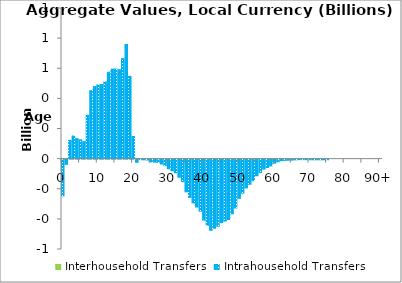
| Category | Interhousehold Transfers | Intrahousehold Transfers |
|---|---|---|
| 0 |  | -244.231 |
|  |  | -34.5 |
| 2 |  | 124.63 |
| 3 |  | 153.501 |
| 4 |  | 136.303 |
| 5 |  | 128.363 |
| 6 |  | 116.279 |
| 7 |  | 291.208 |
| 8 |  | 454.32 |
| 9 |  | 481.487 |
| 10 |  | 492.347 |
| 11 |  | 495.006 |
| 12 |  | 512.611 |
| 13 |  | 576.749 |
| 14 |  | 597.402 |
| 15 |  | 598.013 |
| 16 |  | 593.978 |
| 17 |  | 667.227 |
| 18 |  | 760.828 |
| 19 |  | 549.218 |
| 20 |  | 150.029 |
| 21 |  | -21 |
| 22 |  | -3.332 |
| 23 |  | -4.567 |
| 24 |  | -5.785 |
| 25 |  | -18.418 |
| 26 |  | -19.976 |
| 27 |  | -21.519 |
| 28 |  | -32.581 |
| 29 |  | -43.626 |
| 30 |  | -63.828 |
| 31 |  | -77.235 |
| 32 |  | -90.618 |
| 33 |  | -120.149 |
| 34 |  | -149.618 |
| 35 |  | -217.033 |
| 36 |  | -254.017 |
| 37 |  | -291.026 |
| 38 |  | -318.207 |
| 39 |  | -345.346 |
| 40 |  | -404.645 |
| 41 |  | -438.589 |
| 42 |  | -472.608 |
| 43 |  | -459.174 |
| 44 |  | -445.763 |
| 45 |  | -421.321 |
| 46 |  | -411.298 |
| 47 |  | -401.309 |
| 48 |  | -362.912 |
| 49 |  | -324.553 |
| 50 |  | -260.537 |
| 51 |  | -225.849 |
| 52 |  | -191.142 |
| 53 |  | -167.237 |
| 54 |  | -143.344 |
| 55 |  | -110.766 |
| 56 |  | -88.632 |
| 57 |  | -66.481 |
| 58 |  | -55.807 |
| 59 |  | -45.143 |
| 60 |  | -27.006 |
| 61 |  | -18.671 |
| 62 |  | -10.326 |
| 63 |  | -8.881 |
| 64 |  | -7.435 |
| 65 |  | -6.46 |
| 66 |  | -4.911 |
| 67 |  | -3.359 |
| 68 |  | -3.368 |
| 69 |  | -3.376 |
| 70 |  | -4.324 |
| 71 |  | -4.334 |
| 72 |  | -4.344 |
| 73 |  | -4.354 |
| 74 |  | -4.37 |
| 75 |  | -4.197 |
| 76 |  | 0 |
| 77 |  | 0 |
| 78 |  | 0 |
| 79 |  | 0 |
| 80 |  | 0 |
| 81 |  | 0 |
| 82 |  | 0 |
| 83 |  | 0 |
| 84 |  | 0 |
| 85 |  | 0 |
| 86 |  | 0 |
| 87 |  | 0 |
| 88 |  | 0 |
| 89 |  | 0 |
| 90+ |  | 0 |